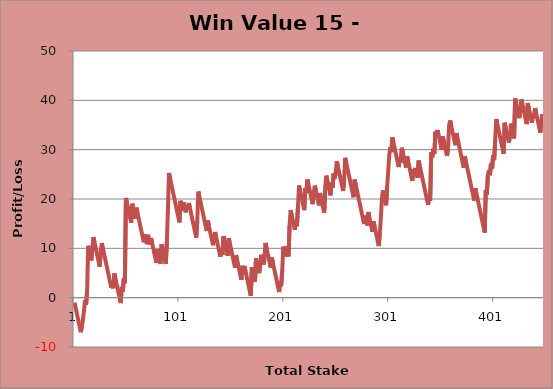
| Category | Series 0 |
|---|---|
| 0 | -1 |
| 1 | -2 |
| 2 | -3 |
| 3 | -4 |
| 4 | -5 |
| 5 | -6 |
| 6 | -7 |
| 7 | -5.85 |
| 8 | -4.38 |
| 9 | -2.78 |
| 10 | -0.48 |
| 11 | -1.48 |
| 12 | 1.27 |
| 13 | 10.52 |
| 14 | 9.52 |
| 15 | 8.52 |
| 16 | 7.52 |
| 17 | 9.96 |
| 18 | 12.27 |
| 19 | 11.27 |
| 20 | 10.27 |
| 21 | 9.27 |
| 22 | 8.27 |
| 23 | 7.27 |
| 24 | 6.27 |
| 25 | 9.35 |
| 26 | 11.05 |
| 27 | 10.05 |
| 28 | 9.05 |
| 29 | 8.05 |
| 30 | 7.05 |
| 31 | 6.05 |
| 32 | 5.05 |
| 33 | 4.05 |
| 34 | 3.05 |
| 35 | 2.05 |
| 36 | 2.9 |
| 37 | 1.9 |
| 38 | 4.9 |
| 39 | 3.9 |
| 40 | 2.9 |
| 41 | 1.9 |
| 42 | 0.9 |
| 43 | -0.1 |
| 44 | -1.1 |
| 45 | 2.2 |
| 46 | 1.2 |
| 47 | 3.93 |
| 48 | 2.93 |
| 49 | 20.18 |
| 50 | 19.18 |
| 51 | 18.18 |
| 52 | 17.18 |
| 53 | 16.18 |
| 54 | 15.18 |
| 55 | 19.04 |
| 56 | 18.04 |
| 57 | 17.04 |
| 58 | 16.04 |
| 59 | 18.24 |
| 60 | 17.24 |
| 61 | 16.24 |
| 62 | 15.24 |
| 63 | 14.24 |
| 64 | 13.24 |
| 65 | 12.24 |
| 66 | 11.24 |
| 67 | 12.84 |
| 68 | 11.84 |
| 69 | 10.84 |
| 70 | 12.74 |
| 71 | 11.74 |
| 72 | 10.74 |
| 73 | 12.07 |
| 74 | 11.07 |
| 75 | 10.07 |
| 76 | 9.07 |
| 77 | 8.07 |
| 78 | 7.07 |
| 79 | 9.82 |
| 80 | 8.82 |
| 81 | 7.82 |
| 82 | 6.82 |
| 83 | 10.82 |
| 84 | 9.82 |
| 85 | 8.82 |
| 86 | 7.82 |
| 87 | 6.82 |
| 88 | 11.32 |
| 89 | 17.5 |
| 90 | 25.26 |
| 91 | 24.26 |
| 92 | 23.26 |
| 93 | 22.26 |
| 94 | 21.26 |
| 95 | 20.26 |
| 96 | 19.26 |
| 97 | 18.26 |
| 98 | 17.26 |
| 99 | 16.26 |
| 100 | 15.26 |
| 101 | 19.64 |
| 102 | 18.64 |
| 103 | 17.64 |
| 104 | 19.28 |
| 105 | 18.28 |
| 106 | 17.28 |
| 107 | 18.79 |
| 108 | 17.79 |
| 109 | 19.18 |
| 110 | 18.18 |
| 111 | 17.18 |
| 112 | 16.18 |
| 113 | 15.18 |
| 114 | 14.18 |
| 115 | 13.18 |
| 116 | 12.18 |
| 117 | 15.51 |
| 118 | 21.51 |
| 119 | 20.51 |
| 120 | 19.51 |
| 121 | 18.51 |
| 122 | 17.51 |
| 123 | 16.51 |
| 124 | 15.51 |
| 125 | 14.51 |
| 126 | 13.51 |
| 127 | 15.63 |
| 128 | 14.63 |
| 129 | 13.63 |
| 130 | 12.63 |
| 131 | 11.63 |
| 132 | 10.63 |
| 133 | 11.8 |
| 134 | 13.31 |
| 135 | 12.31 |
| 136 | 11.31 |
| 137 | 10.31 |
| 138 | 9.31 |
| 139 | 8.31 |
| 140 | 9.68 |
| 141 | 8.68 |
| 142 | 12.48 |
| 143 | 11.48 |
| 144 | 10.48 |
| 145 | 9.48 |
| 146 | 8.48 |
| 147 | 12.08 |
| 148 | 11.08 |
| 149 | 10.08 |
| 150 | 9.08 |
| 151 | 8.08 |
| 152 | 7.08 |
| 153 | 6.08 |
| 154 | 8.63 |
| 155 | 7.63 |
| 156 | 6.63 |
| 157 | 5.63 |
| 158 | 4.63 |
| 159 | 3.63 |
| 160 | 6.46 |
| 161 | 5.46 |
| 162 | 6.37 |
| 163 | 5.37 |
| 164 | 4.37 |
| 165 | 3.37 |
| 166 | 2.37 |
| 167 | 1.37 |
| 168 | 0.37 |
| 169 | 6.17 |
| 170 | 5.17 |
| 171 | 4.17 |
| 172 | 3.17 |
| 173 | 7.96 |
| 174 | 6.96 |
| 175 | 5.96 |
| 176 | 4.96 |
| 177 | 6.71 |
| 178 | 8.71 |
| 179 | 7.71 |
| 180 | 6.71 |
| 181 | 7.59 |
| 182 | 11.09 |
| 183 | 10.09 |
| 184 | 9.09 |
| 185 | 8.09 |
| 186 | 7.09 |
| 187 | 6.09 |
| 188 | 8.14 |
| 189 | 7.14 |
| 190 | 6.14 |
| 191 | 5.14 |
| 192 | 4.14 |
| 193 | 3.14 |
| 194 | 2.14 |
| 195 | 1.14 |
| 196 | 3.33 |
| 197 | 2.33 |
| 198 | 5.54 |
| 199 | 10.36 |
| 200 | 9.36 |
| 201 | 8.36 |
| 202 | 10.36 |
| 203 | 9.36 |
| 204 | 8.36 |
| 205 | 14.63 |
| 206 | 17.74 |
| 207 | 16.74 |
| 208 | 15.74 |
| 209 | 14.74 |
| 210 | 13.74 |
| 211 | 15.49 |
| 212 | 14.49 |
| 213 | 18.49 |
| 214 | 22.74 |
| 215 | 21.74 |
| 216 | 20.74 |
| 217 | 19.74 |
| 218 | 18.74 |
| 219 | 17.74 |
| 220 | 22.2 |
| 221 | 21.2 |
| 222 | 23.95 |
| 223 | 22.95 |
| 224 | 21.95 |
| 225 | 20.95 |
| 226 | 19.95 |
| 227 | 18.95 |
| 228 | 21.11 |
| 229 | 22.71 |
| 230 | 21.71 |
| 231 | 20.71 |
| 232 | 19.71 |
| 233 | 18.71 |
| 234 | 21.21 |
| 235 | 20.21 |
| 236 | 19.21 |
| 237 | 18.21 |
| 238 | 17.21 |
| 239 | 22.33 |
| 240 | 24.73 |
| 241 | 23.73 |
| 242 | 22.73 |
| 243 | 21.73 |
| 244 | 20.73 |
| 245 | 23.32 |
| 246 | 22.32 |
| 247 | 25.15 |
| 248 | 24.15 |
| 249 | 25.45 |
| 250 | 27.65 |
| 251 | 26.65 |
| 252 | 25.65 |
| 253 | 24.65 |
| 254 | 23.65 |
| 255 | 22.65 |
| 256 | 21.65 |
| 257 | 23.85 |
| 258 | 28.35 |
| 259 | 27.35 |
| 260 | 26.35 |
| 261 | 25.35 |
| 262 | 24.35 |
| 263 | 23.35 |
| 264 | 22.35 |
| 265 | 21.35 |
| 266 | 20.35 |
| 267 | 23.93 |
| 268 | 22.93 |
| 269 | 21.93 |
| 270 | 20.93 |
| 271 | 19.93 |
| 272 | 18.93 |
| 273 | 17.93 |
| 274 | 16.93 |
| 275 | 15.93 |
| 276 | 14.93 |
| 277 | 16.64 |
| 278 | 15.64 |
| 279 | 14.64 |
| 280 | 17.36 |
| 281 | 16.36 |
| 282 | 15.36 |
| 283 | 14.36 |
| 284 | 13.36 |
| 285 | 15.46 |
| 286 | 14.46 |
| 287 | 13.46 |
| 288 | 12.46 |
| 289 | 11.46 |
| 290 | 10.46 |
| 291 | 13.11 |
| 292 | 16.11 |
| 293 | 20.11 |
| 294 | 21.73 |
| 295 | 20.73 |
| 296 | 19.73 |
| 297 | 18.73 |
| 298 | 22.59 |
| 299 | 25.59 |
| 300 | 28.88 |
| 301 | 30.48 |
| 302 | 29.48 |
| 303 | 32.48 |
| 304 | 31.48 |
| 305 | 30.48 |
| 306 | 29.48 |
| 307 | 28.48 |
| 308 | 27.48 |
| 309 | 26.48 |
| 310 | 28.38 |
| 311 | 27.38 |
| 312 | 30.38 |
| 313 | 29.38 |
| 314 | 28.38 |
| 315 | 27.38 |
| 316 | 26.38 |
| 317 | 28.68 |
| 318 | 27.68 |
| 319 | 26.68 |
| 320 | 25.68 |
| 321 | 24.68 |
| 322 | 23.68 |
| 323 | 25.97 |
| 324 | 24.97 |
| 325 | 26.29 |
| 326 | 25.29 |
| 327 | 24.29 |
| 328 | 27.8 |
| 329 | 26.8 |
| 330 | 25.8 |
| 331 | 24.8 |
| 332 | 23.8 |
| 333 | 22.8 |
| 334 | 21.8 |
| 335 | 20.8 |
| 336 | 19.8 |
| 337 | 18.8 |
| 338 | 20.63 |
| 339 | 19.63 |
| 340 | 29.44 |
| 341 | 28.44 |
| 342 | 30.17 |
| 343 | 29.17 |
| 344 | 33.67 |
| 345 | 32.67 |
| 346 | 33.98 |
| 347 | 32.98 |
| 348 | 31.98 |
| 349 | 30.98 |
| 350 | 29.98 |
| 351 | 32.73 |
| 352 | 31.73 |
| 353 | 30.73 |
| 354 | 29.73 |
| 355 | 28.73 |
| 356 | 30.18 |
| 357 | 34.81 |
| 358 | 35.91 |
| 359 | 34.91 |
| 360 | 33.91 |
| 361 | 32.91 |
| 362 | 31.91 |
| 363 | 30.91 |
| 364 | 33.34 |
| 365 | 32.34 |
| 366 | 31.34 |
| 367 | 30.34 |
| 368 | 29.34 |
| 369 | 28.34 |
| 370 | 27.34 |
| 371 | 26.34 |
| 372 | 28.68 |
| 373 | 27.68 |
| 374 | 26.68 |
| 375 | 25.68 |
| 376 | 24.68 |
| 377 | 23.68 |
| 378 | 22.68 |
| 379 | 21.68 |
| 380 | 20.68 |
| 381 | 19.68 |
| 382 | 22.19 |
| 383 | 21.19 |
| 384 | 20.19 |
| 385 | 19.19 |
| 386 | 18.19 |
| 387 | 17.19 |
| 388 | 16.19 |
| 389 | 15.19 |
| 390 | 14.19 |
| 391 | 13.19 |
| 392 | 21.82 |
| 393 | 20.82 |
| 394 | 24.75 |
| 395 | 25.81 |
| 396 | 24.81 |
| 397 | 27.17 |
| 398 | 26.17 |
| 399 | 28.86 |
| 400 | 27.86 |
| 401 | 32.02 |
| 402 | 36.2 |
| 403 | 35.2 |
| 404 | 34.2 |
| 405 | 33.2 |
| 406 | 32.2 |
| 407 | 31.2 |
| 408 | 30.2 |
| 409 | 29.2 |
| 410 | 35.46 |
| 411 | 34.46 |
| 412 | 33.46 |
| 413 | 32.46 |
| 414 | 31.46 |
| 415 | 32.73 |
| 416 | 35.29 |
| 417 | 34.29 |
| 418 | 33.29 |
| 419 | 32.29 |
| 420 | 40.38 |
| 421 | 39.38 |
| 422 | 38.38 |
| 423 | 37.38 |
| 424 | 36.38 |
| 425 | 38.34 |
| 426 | 40.18 |
| 427 | 39.18 |
| 428 | 38.18 |
| 429 | 37.18 |
| 430 | 36.18 |
| 431 | 35.18 |
| 432 | 39.44 |
| 433 | 38.44 |
| 434 | 37.44 |
| 435 | 36.44 |
| 436 | 35.44 |
| 437 | 37.33 |
| 438 | 36.33 |
| 439 | 38.43 |
| 440 | 37.43 |
| 441 | 36.43 |
| 442 | 35.43 |
| 443 | 34.43 |
| 444 | 33.43 |
| 445 | 36.02 |
| 446 | 37.22 |
| 447 | 36.22 |